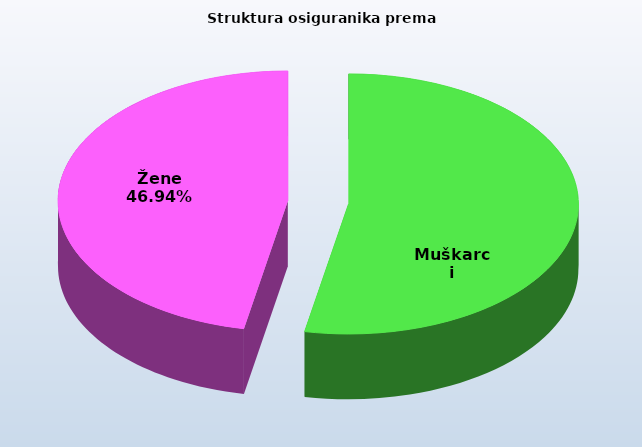
| Category | Series 0 |
|---|---|
| Muškarci | 871511 |
| Žene | 771040 |